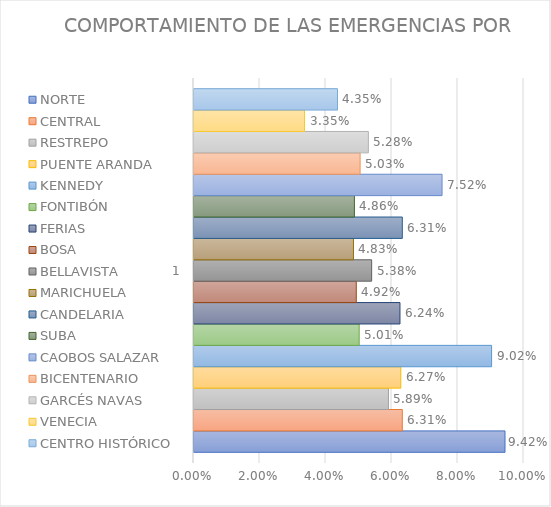
| Category | NORTE | CENTRAL | RESTREPO | PUENTE ARANDA | KENNEDY | FONTIBÓN | FERIAS | BOSA | BELLAVISTA | MARICHUELA | CANDELARIA | SUBA | CAOBOS SALAZAR | BICENTENARIO | GARCÉS NAVAS | VENECIA | CENTRO HISTÓRICO |
|---|---|---|---|---|---|---|---|---|---|---|---|---|---|---|---|---|---|
| 0 | 0.094 | 0.063 | 0.059 | 0.063 | 0.09 | 0.05 | 0.062 | 0.049 | 0.054 | 0.048 | 0.063 | 0.049 | 0.075 | 0.05 | 0.053 | 0.033 | 0.043 |